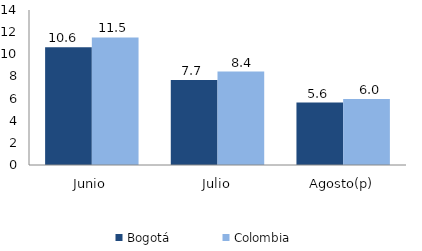
| Category | Bogotá | Colombia |
|---|---|---|
| Junio | 10.633 | 11.521 |
| Julio | 7.678 | 8.44 |
| Agosto(p) | 5.638 | 5.952 |